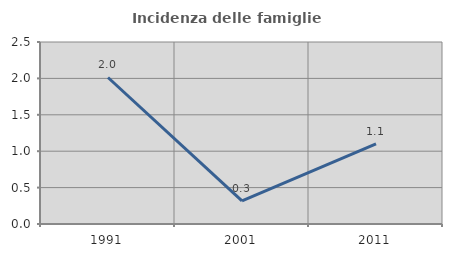
| Category | Incidenza delle famiglie numerose |
|---|---|
| 1991.0 | 2.013 |
| 2001.0 | 0.316 |
| 2011.0 | 1.101 |